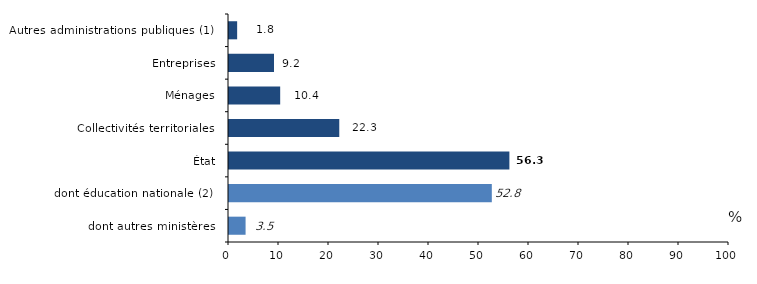
| Category | Series 0 |
|---|---|
| dont autres ministères | 3.517 |
| dont éducation nationale (2) | 52.762 |
| État | 56.279 |
| Collectivités territoriales | 22.254 |
| Ménages | 10.437 |
| Entreprises | 9.201 |
| Autres administrations publiques (1) | 1.83 |